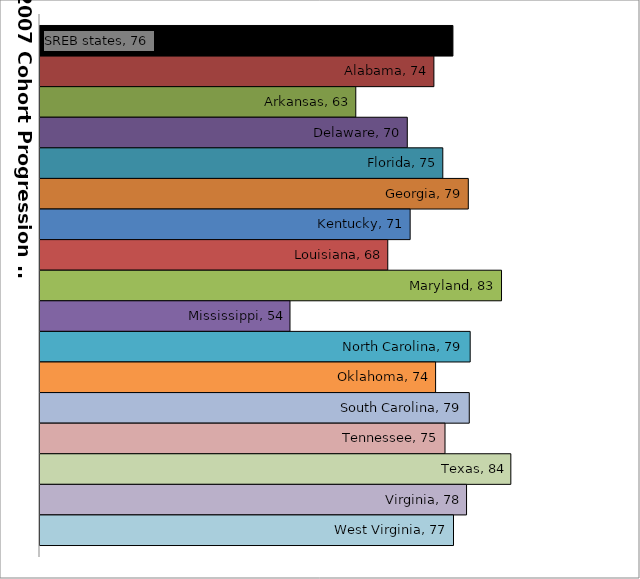
| Category | SREB states | Alabama | Arkansas | Delaware | Florida | Georgia | Kentucky | Louisiana | Maryland | Mississippi | North Carolina | Oklahoma | South Carolina | Tennessee | Texas | Virginia | West Virginia |
|---|---|---|---|---|---|---|---|---|---|---|---|---|---|---|---|---|---|
| 0 | 76.47 | 73.867 | 63.186 | 70.227 | 75.084 | 78.571 | 70.62 | 67.559 | 83.114 | 54.188 | 78.828 | 74.098 | 78.703 | 75.386 | 84.388 | 78.332 | 76.548 |